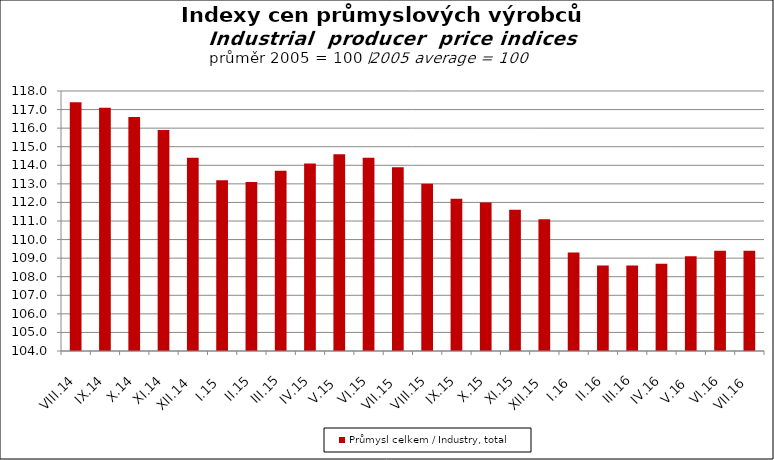
| Category | Průmysl celkem / Industry, total |
|---|---|
| VIII.14 | 117.4 |
| IX.14 | 117.1 |
| X.14 | 116.6 |
| XI.14 | 115.9 |
| XII.14 | 114.4 |
| I.15 | 113.2 |
| II.15 | 113.1 |
| III.15 | 113.7 |
| IV.15 | 114.1 |
| V.15 | 114.6 |
| VI.15 | 114.4 |
| VII.15 | 113.9 |
| VIII.15 | 113 |
| IX.15 | 112.2 |
| X.15 | 112 |
| XI.15 | 111.6 |
| XII.15 | 111.1 |
| I.16 | 109.3 |
| II.16 | 108.6 |
| III.16 | 108.6 |
| IV.16 | 108.7 |
| V.16 | 109.1 |
| VI.16 | 109.4 |
| VII.16 | 109.4 |